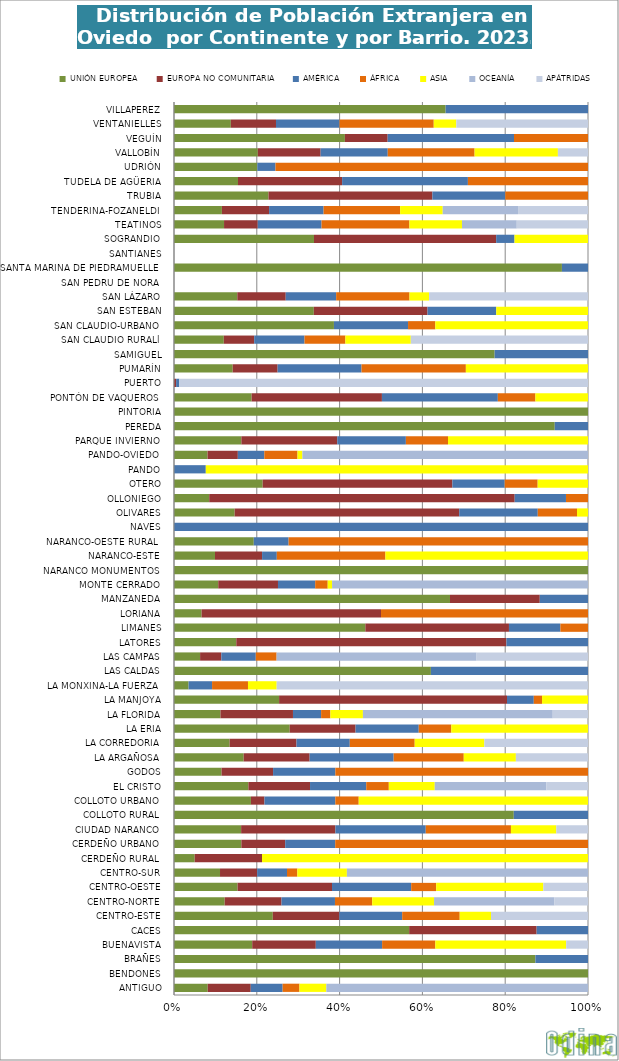
| Category | UNIÓN EUROPEA | EUROPA NO COMUNITARIA | AMÉRICA | ÁFRICA | ASIA | OCEANÍA | APÁTRIDAS |
|---|---|---|---|---|---|---|---|
| ANTIGUO | 0.02 | 0.025 | 0.019 | 0.01 | 0.016 | 0.154 | 0 |
| BENDONES | 0.002 | 0 | 0 | 0 | 0 | 0 | 0 |
| BRAÑES | 0.001 | 0 | 0 | 0 | 0 | 0 | 0 |
| BUENAVISTA | 0.051 | 0.042 | 0.043 | 0.035 | 0.086 | 0 | 0.014 |
| CACES | 0.002 | 0.001 | 0 | 0 | 0 | 0 | 0 |
| CENTRO-ESTE | 0.029 | 0.02 | 0.019 | 0.017 | 0.009 | 0 | 0.029 |
| CENTRO-NORTE | 0.065 | 0.073 | 0.068 | 0.048 | 0.079 | 0.154 | 0.043 |
| CENTRO-OESTE | 0.02 | 0.03 | 0.025 | 0.008 | 0.034 | 0 | 0.014 |
| CENTRO-SUR | 0.029 | 0.024 | 0.019 | 0.007 | 0.032 | 0.154 | 0 |
| CERDEÑO RURAL | 0 | 0.001 | 0 | 0 | 0.004 | 0 | 0 |
| CERDEÑO URBANO | 0.003 | 0.002 | 0.002 | 0.009 | 0 | 0 | 0 |
| CIUDAD NARANCO | 0.06 | 0.085 | 0.081 | 0.077 | 0.041 | 0 | 0.029 |
| COLLOTO RURAL | 0.001 | 0 | 0 | 0 | 0 | 0 | 0 |
| COLLOTO URBANO | 0.009 | 0.002 | 0.009 | 0.003 | 0.028 | 0 | 0 |
| EL CRISTO | 0.051 | 0.042 | 0.039 | 0.016 | 0.032 | 0.077 | 0.029 |
| GODOS | 0.002 | 0.002 | 0.002 | 0.008 | 0 | 0 | 0 |
| LA ARGAÑOSA | 0.083 | 0.078 | 0.1 | 0.083 | 0.062 | 0 | 0.086 |
| LA CORREDORIA | 0.054 | 0.064 | 0.051 | 0.063 | 0.067 | 0 | 0.1 |
| LA ERIA | 0.01 | 0.006 | 0.005 | 0.003 | 0.012 | 0 | 0 |
| LA FLORIDA | 0.019 | 0.029 | 0.011 | 0.004 | 0.013 | 0.077 | 0.014 |
| LA MANJOYA | 0.006 | 0.013 | 0.002 | 0 | 0.003 | 0 | 0 |
| LA MONXINA-LA FUERZA | 0.004 | 0 | 0.006 | 0.01 | 0.008 | 0 | 0.086 |
| LAS CALDAS | 0.001 | 0 | 0.001 | 0 | 0 | 0 | 0 |
| LAS CAMPAS | 0.01 | 0.008 | 0.013 | 0.008 | 0 | 0.077 | 0.043 |
| LATORES | 0.002 | 0.007 | 0.002 | 0 | 0 | 0 | 0 |
| LIMANES | 0.003 | 0.002 | 0.001 | 0 | 0 | 0 | 0 |
| LORIANA | 0 | 0.002 | 0 | 0.002 | 0 | 0 | 0 |
| MANZANEDA | 0.003 | 0.001 | 0 | 0 | 0 | 0 | 0 |
| MONTE CERRADO | 0.013 | 0.018 | 0.011 | 0.004 | 0.001 | 0.077 | 0 |
| NARANCO MONUMENTOS | 0.001 | 0 | 0 | 0 | 0 | 0 | 0 |
| NARANCO-ESTE | 0.004 | 0.005 | 0.002 | 0.011 | 0.021 | 0 | 0 |
| NARANCO-OESTE RURAL | 0.001 | 0 | 0 | 0.002 | 0 | 0 | 0 |
| NAVES | 0 | 0 | 0 | 0 | 0 | 0 | 0 |
| OLIVARES | 0.007 | 0.027 | 0.009 | 0.005 | 0.001 | 0 | 0 |
| OLLONIEGO | 0.001 | 0.007 | 0.001 | 0 | 0 | 0 | 0 |
| OTERO | 0.028 | 0.06 | 0.016 | 0.01 | 0.016 | 0 | 0 |
| PANDO | 0 | 0 | 0 | 0 | 0.001 | 0 | 0 |
| PANDO-OVIEDO | 0.009 | 0.008 | 0.007 | 0.009 | 0.001 | 0.077 | 0 |
| PARQUE INVIERNO | 0.012 | 0.017 | 0.012 | 0.008 | 0.025 | 0 | 0 |
| PEREDA | 0.001 | 0 | 0 | 0 | 0 | 0 | 0 |
| PINTORIA | 0.001 | 0 | 0 | 0 | 0 | 0 | 0 |
| PONTÓN DE VAQUEROS | 0.008 | 0.013 | 0.012 | 0.004 | 0.005 | 0 | 0 |
| PUERTO | 0 | 0.001 | 0.001 | 0 | 0 | 0 | 0.157 |
| PUMARÍN | 0.081 | 0.062 | 0.116 | 0.144 | 0.169 | 0 | 0 |
| SAMIGUEL | 0.001 | 0 | 0 | 0 | 0 | 0 | 0 |
| SAN CLAUDIO RURALl | 0.004 | 0.002 | 0.004 | 0.003 | 0.005 | 0 | 0.014 |
| SAN CLAUDIO-URBANO | 0.008 | 0 | 0.004 | 0.001 | 0.008 | 0 | 0 |
| SAN ESTEBAN | 0.002 | 0.002 | 0.001 | 0 | 0.001 | 0 | 0 |
| SAN LÁZARO | 0.017 | 0.013 | 0.014 | 0.02 | 0.005 | 0 | 0.043 |
| SAN PEDRU DE NORA | 0 | 0 | 0 | 0 | 0 | 0 | 0 |
| SANTA MARINA DE PIEDRAMUELLE | 0.003 | 0 | 0 | 0 | 0 | 0 | 0 |
| SANTIANES | 0 | 0 | 0 | 0 | 0 | 0 | 0 |
| SOGRANDIO | 0.003 | 0.003 | 0 | 0 | 0.001 | 0 | 0 |
| TEATINOS | 0.07 | 0.047 | 0.09 | 0.123 | 0.074 | 0.077 | 0.1 |
| TENDERINA-FOZANELDI | 0.049 | 0.048 | 0.056 | 0.078 | 0.043 | 0.077 | 0.071 |
| TRUBIA | 0.008 | 0.013 | 0.006 | 0.007 | 0 | 0 | 0 |
| TUDELA DE AGÜERIA | 0.001 | 0.002 | 0.002 | 0.002 | 0 | 0 | 0 |
| UDRIÓN | 0.001 | 0 | 0 | 0.004 | 0 | 0 | 0 |
| VALLOBÍN | 0.08 | 0.06 | 0.064 | 0.082 | 0.079 | 0 | 0.029 |
| VEGUÍN | 0.003 | 0.001 | 0.002 | 0.001 | 0 | 0 | 0 |
| VENTANIELLES | 0.043 | 0.034 | 0.048 | 0.072 | 0.017 | 0 | 0.1 |
| VILLAPEREZ | 0.001 | 0 | 0.001 | 0 | 0 | 0 | 0 |